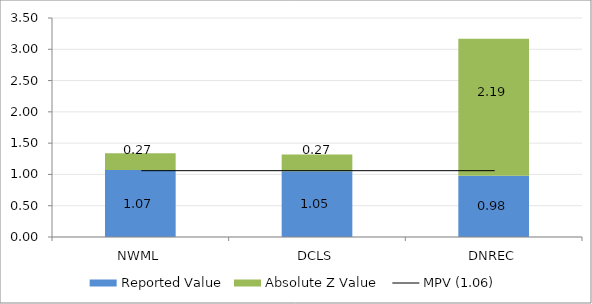
| Category | Reported Value | Absolute Z Value  |
|---|---|---|
| NWML | 1.07 | 0.27 |
| DCLS | 1.05 | 0.27 |
| DNREC | 0.979 | 2.189 |